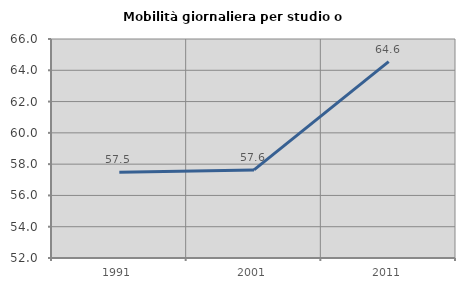
| Category | Mobilità giornaliera per studio o lavoro |
|---|---|
| 1991.0 | 57.481 |
| 2001.0 | 57.629 |
| 2011.0 | 64.558 |